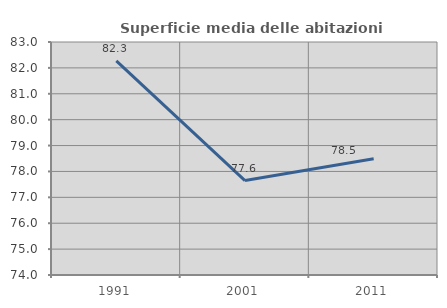
| Category | Superficie media delle abitazioni occupate |
|---|---|
| 1991.0 | 82.269 |
| 2001.0 | 77.648 |
| 2011.0 | 78.49 |